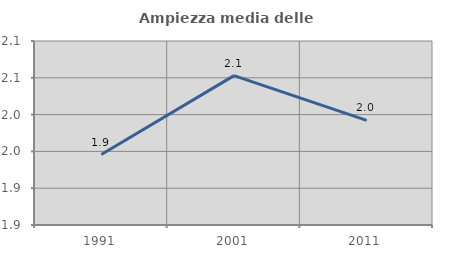
| Category | Ampiezza media delle famiglie |
|---|---|
| 1991.0 | 1.946 |
| 2001.0 | 2.053 |
| 2011.0 | 1.992 |